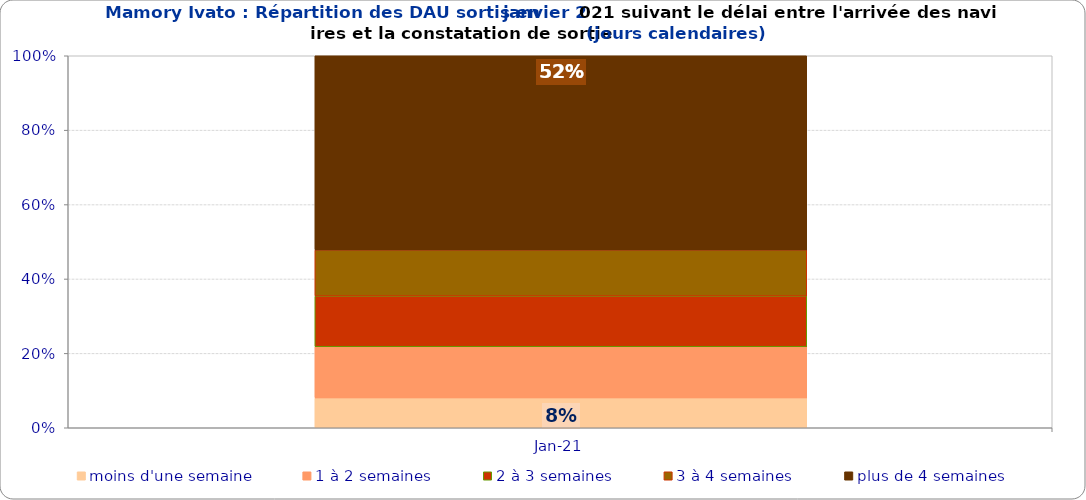
| Category | moins d'une semaine | 1 à 2 semaines | 2 à 3 semaines | 3 à 4 semaines | plus de 4 semaines |
|---|---|---|---|---|---|
| 2021-01-01 | 0.08 | 0.138 | 0.136 | 0.124 | 0.522 |